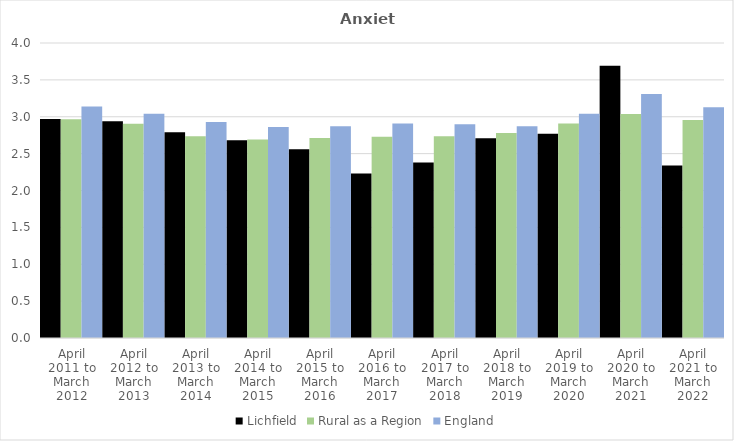
| Category | Lichfield | Rural as a Region | England |
|---|---|---|---|
| April 2011 to March 2012 | 2.97 | 2.967 | 3.14 |
| April 2012 to March 2013 | 2.94 | 2.904 | 3.04 |
| April 2013 to March 2014 | 2.79 | 2.734 | 2.93 |
| April 2014 to March 2015 | 2.68 | 2.691 | 2.86 |
| April 2015 to March 2016 | 2.56 | 2.711 | 2.87 |
| April 2016 to March 2017 | 2.23 | 2.729 | 2.91 |
| April 2017 to March 2018 | 2.38 | 2.736 | 2.9 |
| April 2018 to March 2019 | 2.71 | 2.78 | 2.87 |
| April 2019 to March 2020 | 2.77 | 2.908 | 3.04 |
| April 2020 to March 2021 | 3.69 | 3.036 | 3.31 |
| April 2021 to March 2022 | 2.34 | 2.956 | 3.13 |